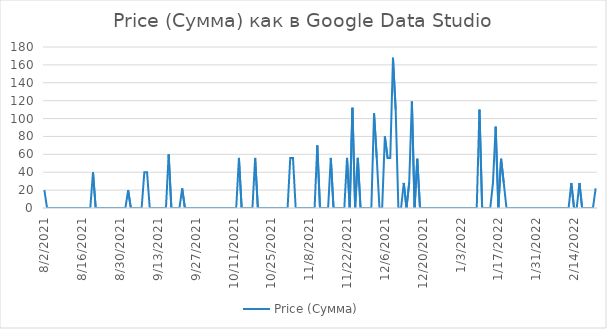
| Category | Price (Сумма) |
|---|---|
| 8/2/21 | 20 |
| 8/3/21 | 0 |
| 8/4/21 | 0 |
| 8/5/21 | 0 |
| 8/6/21 | 0 |
| 8/7/21 | 0 |
| 8/8/21 | 0 |
| 8/9/21 | 0 |
| 8/10/21 | 0 |
| 8/11/21 | 0 |
| 8/12/21 | 0 |
| 8/13/21 | 0 |
| 8/14/21 | 0 |
| 8/15/21 | 0 |
| 8/16/21 | 0 |
| 8/17/21 | 0 |
| 8/18/21 | 0 |
| 8/19/21 | 0 |
| 8/20/21 | 40 |
| 8/21/21 | 0 |
| 8/22/21 | 0 |
| 8/23/21 | 0 |
| 8/24/21 | 0 |
| 8/25/21 | 0 |
| 8/26/21 | 0 |
| 8/27/21 | 0 |
| 8/28/21 | 0 |
| 8/29/21 | 0 |
| 8/30/21 | 0 |
| 8/31/21 | 0 |
| 9/1/21 | 0 |
| 9/2/21 | 20 |
| 9/3/21 | 0 |
| 9/4/21 | 0 |
| 9/5/21 | 0 |
| 9/6/21 | 0 |
| 9/7/21 | 0 |
| 9/8/21 | 40 |
| 9/9/21 | 40 |
| 9/10/21 | 0 |
| 9/11/21 | 0 |
| 9/12/21 | 0 |
| 9/13/21 | 0 |
| 9/14/21 | 0 |
| 9/15/21 | 0 |
| 9/16/21 | 0 |
| 9/17/21 | 60 |
| 9/18/21 | 0 |
| 9/19/21 | 0 |
| 9/20/21 | 0 |
| 9/21/21 | 0 |
| 9/22/21 | 22 |
| 9/23/21 | 0 |
| 9/24/21 | 0 |
| 9/25/21 | 0 |
| 9/26/21 | 0 |
| 9/27/21 | 0 |
| 9/28/21 | 0 |
| 9/29/21 | 0 |
| 9/30/21 | 0 |
| 10/1/21 | 0 |
| 10/2/21 | 0 |
| 10/3/21 | 0 |
| 10/4/21 | 0 |
| 10/5/21 | 0 |
| 10/6/21 | 0 |
| 10/7/21 | 0 |
| 10/8/21 | 0 |
| 10/9/21 | 0 |
| 10/10/21 | 0 |
| 10/11/21 | 0 |
| 10/12/21 | 0 |
| 10/13/21 | 56 |
| 10/14/21 | 0 |
| 10/15/21 | 0 |
| 10/16/21 | 0 |
| 10/17/21 | 0 |
| 10/18/21 | 0 |
| 10/19/21 | 56 |
| 10/20/21 | 0 |
| 10/21/21 | 0 |
| 10/22/21 | 0 |
| 10/23/21 | 0 |
| 10/24/21 | 0 |
| 10/25/21 | 0 |
| 10/26/21 | 0 |
| 10/27/21 | 0 |
| 10/28/21 | 0 |
| 10/29/21 | 0 |
| 10/30/21 | 0 |
| 10/31/21 | 0 |
| 11/1/21 | 56 |
| 11/2/21 | 56 |
| 11/3/21 | 0 |
| 11/4/21 | 0 |
| 11/5/21 | 0 |
| 11/6/21 | 0 |
| 11/7/21 | 0 |
| 11/8/21 | 0 |
| 11/9/21 | 0 |
| 11/10/21 | 0 |
| 11/11/21 | 70 |
| 11/12/21 | 0 |
| 11/13/21 | 0 |
| 11/14/21 | 0 |
| 11/15/21 | 0 |
| 11/16/21 | 56 |
| 11/17/21 | 0 |
| 11/18/21 | 0 |
| 11/19/21 | 0 |
| 11/20/21 | 0 |
| 11/21/21 | 0 |
| 11/22/21 | 56 |
| 11/23/21 | 0 |
| 11/24/21 | 112 |
| 11/25/21 | 0 |
| 11/26/21 | 56 |
| 11/27/21 | 0 |
| 11/28/21 | 0 |
| 11/29/21 | 0 |
| 11/30/21 | 0 |
| 12/1/21 | 0 |
| 12/2/21 | 106 |
| 12/3/21 | 56 |
| 12/4/21 | 0 |
| 12/5/21 | 0 |
| 12/6/21 | 80 |
| 12/7/21 | 56 |
| 12/8/21 | 56 |
| 12/9/21 | 168 |
| 12/10/21 | 110 |
| 12/11/21 | 0 |
| 12/12/21 | 0 |
| 12/13/21 | 28 |
| 12/14/21 | 0 |
| 12/15/21 | 28 |
| 12/16/21 | 119 |
| 12/17/21 | 0 |
| 12/18/21 | 55 |
| 12/19/21 | 0 |
| 12/20/21 | 0 |
| 12/21/21 | 0 |
| 12/22/21 | 0 |
| 12/23/21 | 0 |
| 12/24/21 | 0 |
| 12/25/21 | 0 |
| 12/26/21 | 0 |
| 12/27/21 | 0 |
| 12/28/21 | 0 |
| 12/29/21 | 0 |
| 12/30/21 | 0 |
| 12/31/21 | 0 |
| 1/1/22 | 0 |
| 1/2/22 | 0 |
| 1/3/22 | 0 |
| 1/4/22 | 0 |
| 1/5/22 | 0 |
| 1/6/22 | 0 |
| 1/7/22 | 0 |
| 1/8/22 | 0 |
| 1/9/22 | 0 |
| 1/10/22 | 110 |
| 1/11/22 | 0 |
| 1/12/22 | 0 |
| 1/13/22 | 0 |
| 1/14/22 | 0 |
| 1/15/22 | 28 |
| 1/16/22 | 91 |
| 1/17/22 | 0 |
| 1/18/22 | 55 |
| 1/19/22 | 28 |
| 1/20/22 | 0 |
| 1/21/22 | 0 |
| 1/22/22 | 0 |
| 1/23/22 | 0 |
| 1/24/22 | 0 |
| 1/25/22 | 0 |
| 1/26/22 | 0 |
| 1/27/22 | 0 |
| 1/28/22 | 0 |
| 1/29/22 | 0 |
| 1/30/22 | 0 |
| 1/31/22 | 0 |
| 2/1/22 | 0 |
| 2/2/22 | 0 |
| 2/3/22 | 0 |
| 2/4/22 | 0 |
| 2/5/22 | 0 |
| 2/6/22 | 0 |
| 2/7/22 | 0 |
| 2/8/22 | 0 |
| 2/9/22 | 0 |
| 2/10/22 | 0 |
| 2/11/22 | 0 |
| 2/12/22 | 0 |
| 2/13/22 | 28 |
| 2/14/22 | 0 |
| 2/15/22 | 0 |
| 2/16/22 | 28 |
| 2/17/22 | 0 |
| 2/18/22 | 0 |
| 2/19/22 | 0 |
| 2/20/22 | 0 |
| 2/21/22 | 0 |
| 2/22/22 | 22 |